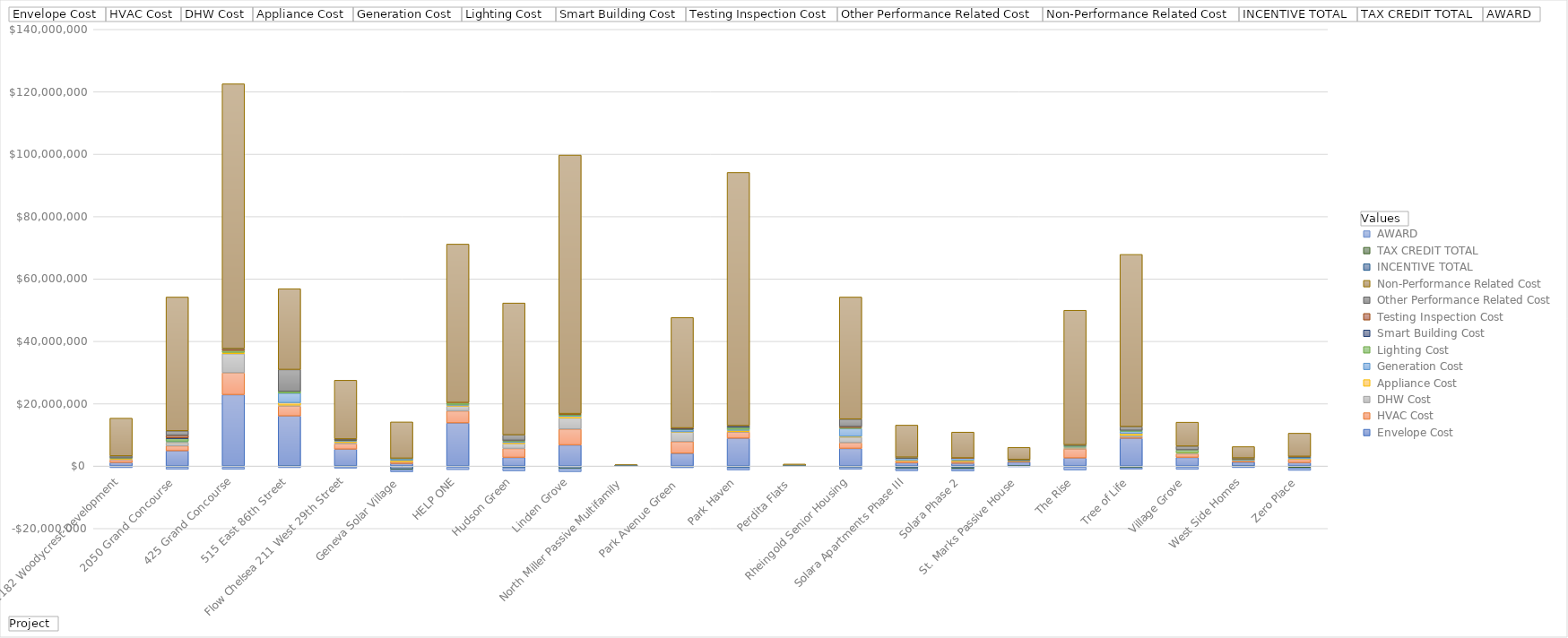
| Category |  Envelope Cost |  HVAC Cost |  DHW Cost |  Appliance Cost |  Generation Cost |  Lighting Cost  |  Smart Building Cost |  Testing Inspection Cost |  Other Performance Related Cost |  Non-Performance Related Cost |  INCENTIVE TOTAL |  TAX CREDIT TOTAL |  AWARD |
|---|---|---|---|---|---|---|---|---|---|---|---|---|---|
| 1182 Woodycrest Development | 1130801.59 | 879051 | 240000 | 140736 | 0 | 200000 | 0 | 0 | 645948 | 12128463.81 | -169700 | 0 | -350931 |
| 2050 Grand Concourse  | 4894107.228 | 1592848.164 | 1059435.67 | 183414 | 239102.25 | 807248.033 | 270000 | 789125 | 1454119.25 | 42899731.587 | -235624 | -55599 | -750000 |
| 425 Grand Concourse | 22898351.84 | 6998906 | 6106206 | 434701 | 0 | 617156 | 0 | 546700 | 50300 | 84887679.16 | -300000 | 0 | -750000 |
| 515 East 86th Street  | 16052777 | 3168000 | 307000 | 788116 | 3072683 | 553272 | 0 | 0 | 7001039.706 | 25917381.706 | -99617.8 | 0 | -425000 |
| Flow Chelsea 211 West 29th Street | 5414207.77 | 1755748.5 | 356582 | 462963.94 | 157000 | 246715.67 | 50000 | 53050 | 198249.76 | 18820784.21 | -145660 | -49394 | -500000 |
| Geneva Solar Village | 823994 | 520783 | 73950 | 410325 | 571158 | 41511 | 0 | 0 | 64637.931 | 11648847 | -978000 | -140885 | -727236 |
| HELP ONE | 13820490 | 3860000 | 1521600 | 291269 | 263398 | 468693 | 0 | 142906 | 0 | 50797762.19 | -300000 | 0 | -850000 |
| Hudson Green | 2761816 | 2870000 | 1545000 | 372200 | 411400 | 260000 | 0 | 37000 | 1742800 | 42282722 | -555000 | 0 | -1000000 |
| Linden Grove | 6779865.441 | 5074592.04 | 3559889.291 | 572717.547 | 232500 | 400000 | 0 | 189900 | 0 | 82895592.98 | -700000 | -100000 | -1000000 |
| North Miller Passive Multifamily | 96977.91 | 8539.65 | 5400 | 7000 | 27815 | 2147.13 | 2300 | 7650 | 5000 | 289777.66 | -12600 | -14255 | -39467 |
| Park Avenue Green  | 4079691.16 | 3770484.94 | 3048214.42 | 63526 | 682830 | 141119.7 | 365000 | 73675 | 0 | 35399236.42 | -270600 | -20400 | -250000 |
| Park Haven | 8918168 | 2028100 | 91500 | 404336 | 339261 | 639515.63 | 403739.06 | 45775 | 100000 | 81164882.15 | -508200 | 0 | -750000 |
| Perdita Flats  | 64925.8 | 30000 | 12400 | 21000 | 34600 | 750 | 0 | 0 | 0 | 500484.2 | -6400 | -14933 | -59976 |
| Rheingold Senior Housing | 5651719.02 | 1830400 | 1791250 | 239216.96 | 2535918.75 | 294500 | 0 | 310000 | 2405000 | 39136690.99 | -339240 | -52250 | -637500 |
| Solara Apartments Phase III | 1057815 | 575523 | 60000 | 233256 | 678000 | 51000 | 45000 | 22372 | 131321 | 10287092 | -558250 | -199800 | -750000 |
| Solara Phase 2 | 884237 | 575523 | 60000 | 299400 | 678000 | 51000 | 45000 | 20826 | 0 | 8280460 | -571050 | -283035 | -750000 |
| St. Marks Passive House | 1286500 | 275000 | 105000 | 120000 | 40000 | 80000 | 0 | 0 | 186730 | 3887850 | -13608 | -29906 | -203082 |
| The Rise | 2579052 | 2922400 | 300000 | 212800 | 273845 | 280000 | 0 | 0 | 260966 | 43128939.45 | -279680 | 0 | -1000000 |
| Tree of Life | 8908493.25 | 366127.83 | 575000 | 625000 | 679194.51 | 300000 | 0 | 0 | 1195947.3 | 55205071.24 | -320000 | -185526 | -500000 |
| Village Grove | 2770500 | 1174200 | 320280 | 30642.95 | 0 | 888684 | 0 | 0 | 1189475 | 7697481.89 | -274000 | 0 | -792438 |
| West Side Homes | 1283405.21 | 415414.84 | 213378.98 | 32298.56 | 119136.74 | 301510.08 | 0 | 500 | 224844.694 | 3646134.94 | -115819 | -27878 | -362620 |
| Zero Place | 1101500 | 1100000 | 50000 | 110630 | 475000 | 10000 | 215000 | 45000 | 0 | 7440183 | -315040 | -313400 | -750000 |